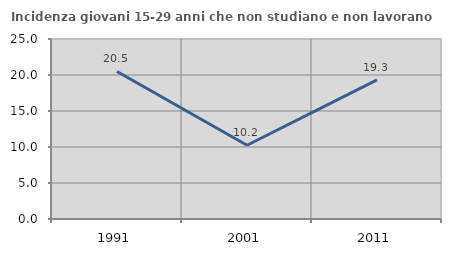
| Category | Incidenza giovani 15-29 anni che non studiano e non lavorano  |
|---|---|
| 1991.0 | 20.492 |
| 2001.0 | 10.244 |
| 2011.0 | 19.324 |